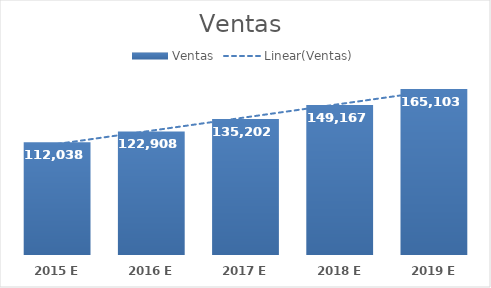
| Category | Ventas |
|---|---|
| 2015 E | 112038.499 |
| 2016 E | 122907.784 |
| 2017 E | 135201.648 |
| 2018 E | 149167.476 |
| 2019 E | 165102.976 |